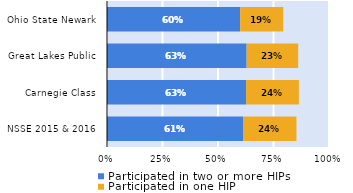
| Category | Participated in two or more HIPs | Participated in one HIP |
|---|---|---|
| NSSE 2015 & 2016 | 0.613 | 0.241 |
| Carnegie Class | 0.627 | 0.238 |
| Great Lakes Public | 0.629 | 0.232 |
| Ohio State Newark | 0.6 | 0.194 |